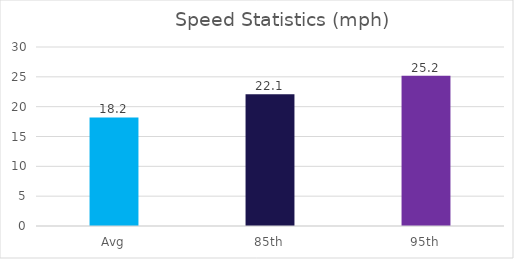
| Category | Series 0 |
|---|---|
| Avg | 18.2 |
| 85th | 22.1 |
| 95th | 25.2 |